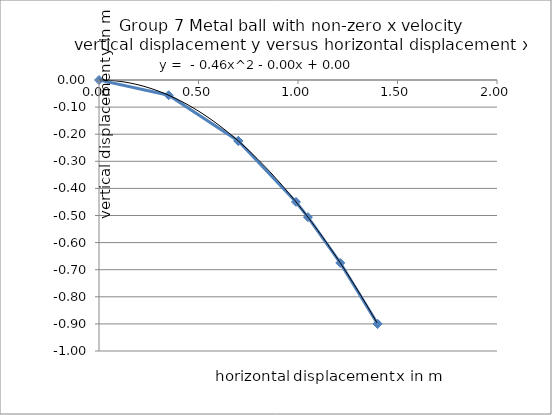
| Category | Series 0 |
|---|---|
| 0.0 | 0 |
| 0.35 | -0.056 |
| 0.7 | -0.225 |
| 0.7 | -0.225 |
| 0.9899494936611666 | -0.45 |
| 1.0499999999999998 | -0.506 |
| 1.2124355652982142 | -0.675 |
| 1.4 | -0.9 |
| 1.4 | -0.9 |